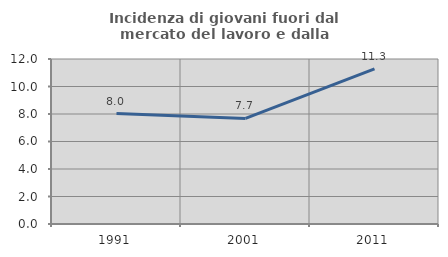
| Category | Incidenza di giovani fuori dal mercato del lavoro e dalla formazione  |
|---|---|
| 1991.0 | 8.032 |
| 2001.0 | 7.678 |
| 2011.0 | 11.281 |